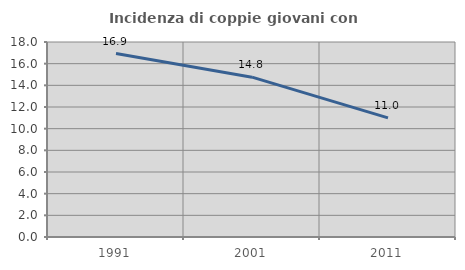
| Category | Incidenza di coppie giovani con figli |
|---|---|
| 1991.0 | 16.934 |
| 2001.0 | 14.754 |
| 2011.0 | 10.995 |